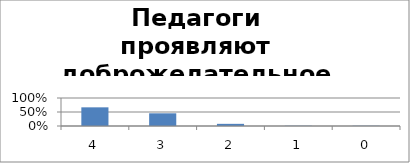
| Category | Педагоги проявляют доброжелательное отношение к нашему ребенку |
|---|---|
| 4.0 | 0.667 |
| 3.0 | 0.453 |
| 2.0 | 0.077 |
| 1.0 | 0.009 |
| 0.0 | 0.009 |